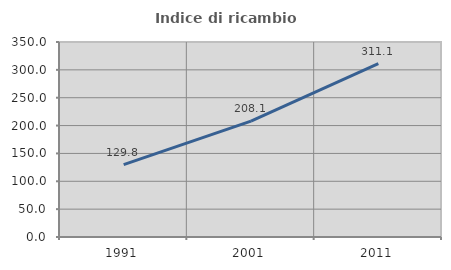
| Category | Indice di ricambio occupazionale  |
|---|---|
| 1991.0 | 129.808 |
| 2001.0 | 208.108 |
| 2011.0 | 311.111 |